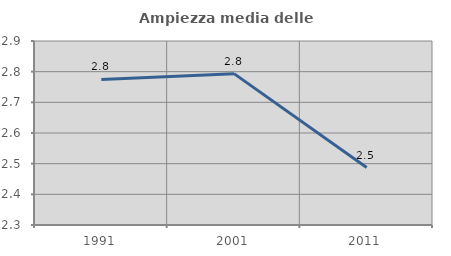
| Category | Ampiezza media delle famiglie |
|---|---|
| 1991.0 | 2.775 |
| 2001.0 | 2.794 |
| 2011.0 | 2.488 |